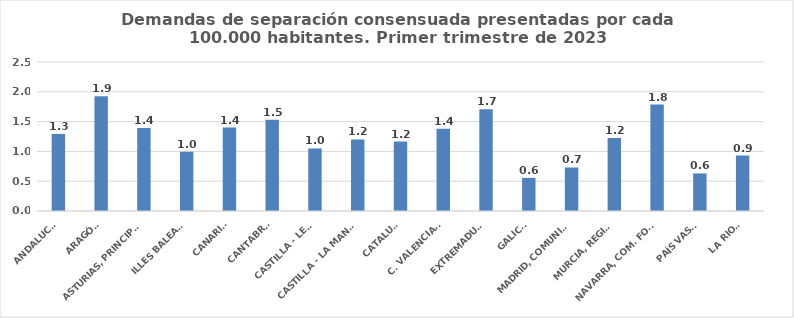
| Category | Series 0 |
|---|---|
| ANDALUCÍA | 1.292 |
| ARAGÓN | 1.927 |
| ASTURIAS, PRINCIPADO | 1.391 |
| ILLES BALEARS | 0.994 |
| CANARIAS | 1.401 |
| CANTABRIA | 1.529 |
| CASTILLA - LEÓN | 1.049 |
| CASTILLA - LA MANCHA | 1.202 |
| CATALUÑA | 1.165 |
| C. VALENCIANA | 1.38 |
| EXTREMADURA | 1.707 |
| GALICIA | 0.556 |
| MADRID, COMUNIDAD | 0.73 |
| MURCIA, REGIÓN | 1.224 |
| NAVARRA, COM. FORAL | 1.785 |
| PAÍS VASCO | 0.631 |
| LA RIOJA | 0.931 |